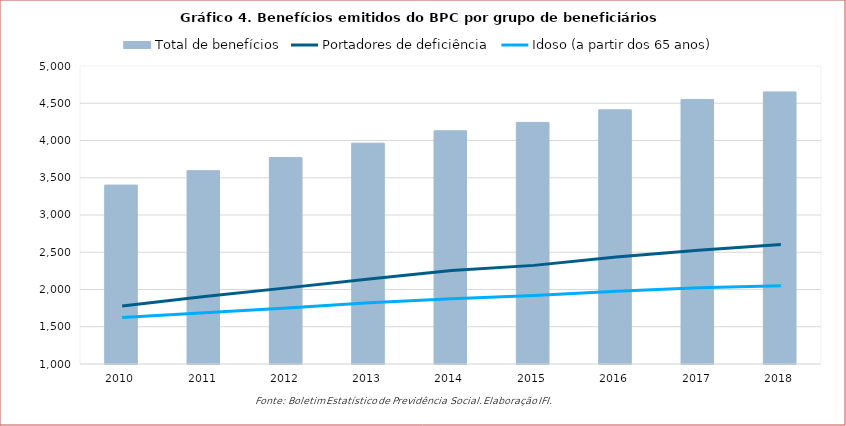
| Category | Total de benefícios |
|---|---|
| 2010.0 | 3401541 |
| 2011.0 | 3595337 |
| 2012.0 | 3771842 |
| 2013.0 | 3964192 |
| 2014.0 | 4130432 |
| 2015.0 | 4242726 |
| 2016.0 | 4411550 |
| 2017.0 | 4549478 |
| 2018.0 | 4651924 |